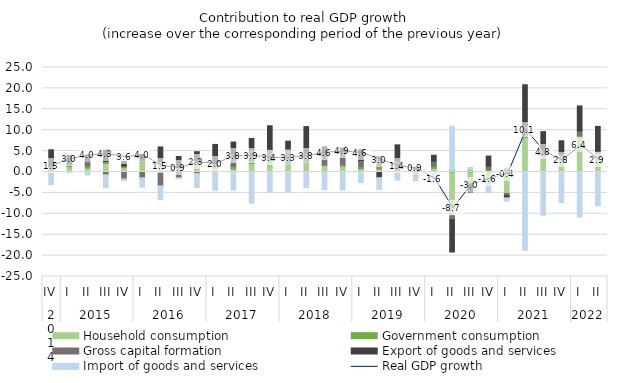
| Category | Household consumption | Government consumption | Gross capital formation | Export of goods and services | Import of goods and services |
|---|---|---|---|---|---|
| 0 | 0.524 | 0.634 | 0.238 | 3.908 | -3.033 |
| 1 | 1.292 | 0.593 | 0.024 | 2.071 | -0.005 |
| 2 | 0.957 | 0.546 | 1.114 | 1.377 | -0.731 |
| 3 | 2.021 | 0.498 | -0.672 | 2.712 | -3.08 |
| 4 | 1.05 | 0.365 | -1.669 | 1.141 | -0.425 |
| 5 | 2.447 | 0.323 | -1.389 | 1.43 | -2.22 |
| 6 | 2.159 | 0.313 | -3.328 | 3.531 | -3.292 |
| 7 | 0.891 | 0.378 | -1.378 | 2.438 | -0.2 |
| 8 | 2.231 | 0.539 | -0.378 | 2.082 | -3.341 |
| 9 | 1.204 | 0.598 | 0.319 | 4.479 | -4.351 |
| 10 | 0.708 | 0.68 | 2.98 | 2.797 | -4.357 |
| 11 | 2.049 | 0.653 | 2.631 | 2.694 | -7.471 |
| 12 | 2.612 | 0.535 | 2.344 | 5.575 | -4.89 |
| 13 | 1.814 | 0.428 | 3.444 | 1.69 | -4.805 |
| 14 | 2.269 | 0.329 | 1.822 | 6.44 | -3.777 |
| 15 | 1.491 | 0.315 | 2.036 | 2.191 | -4.193 |
| 16 | 1.402 | 0.386 | 3.023 | 0.923 | -4.321 |
| 17 | 0.77 | 0.499 | 1.487 | 2.599 | -2.507 |
| 18 | 0.69 | 0.593 | 2.448 | -1.361 | -2.825 |
| 19 | 0.053 | 0.625 | 1.976 | 3.838 | -1.951 |
| 20 | -0.943 | 0.581 | 0.254 | 0.198 | -1.155 |
| 21 | 0.878 | 0.507 | 1.189 | 1.433 | -2.659 |
| 22 | -10.465 | 0.433 | -0.958 | -7.717 | 10.507 |
| 23 | -2.689 | 0.488 | -0.413 | -1.683 | 0.591 |
| 24 | -2.902 | 0.602 | 0.833 | 2.377 | -2.042 |
| 25 | -5.127 | 0.745 | -0.522 | -0.54 | -0.796 |
| 26 | 8.348 | 0.916 | 1.916 | 9.688 | -18.728 |
| 27 | 3.887 | 0.788 | 1.048 | 3.934 | -10.359 |
| 28 | 3.583 | 0.641 | 0.083 | 3.155 | -7.295 |
| 29 | 8.314 | 0.489 | 1.025 | 5.983 | -10.8 |
| 30 | 4.467 | 0.423 | 0.146 | 5.872 | -8.097 |